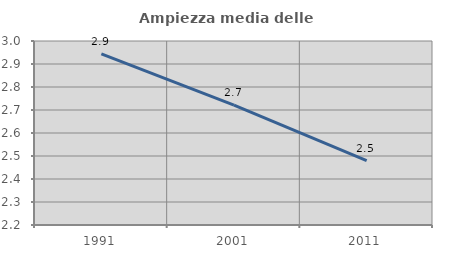
| Category | Ampiezza media delle famiglie |
|---|---|
| 1991.0 | 2.944 |
| 2001.0 | 2.721 |
| 2011.0 | 2.48 |